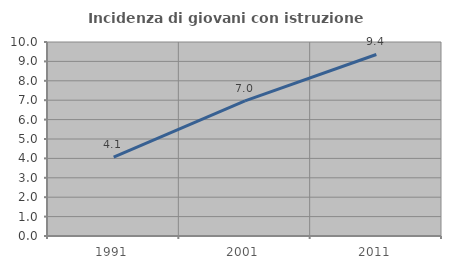
| Category | Incidenza di giovani con istruzione universitaria |
|---|---|
| 1991.0 | 4.07 |
| 2001.0 | 6.965 |
| 2011.0 | 9.357 |